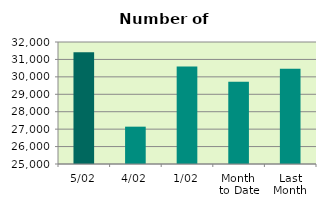
| Category | Series 0 |
|---|---|
| 5/02 | 31418 |
| 4/02 | 27142 |
| 1/02 | 30592 |
| Month 
to Date | 29717.333 |
| Last
Month | 30462.455 |